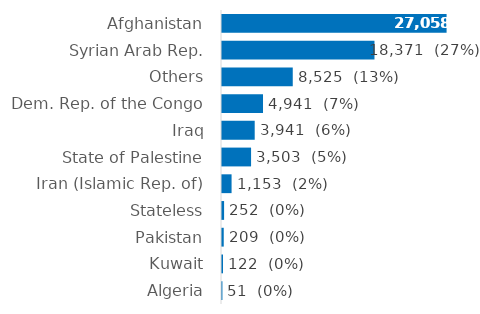
| Category | Series 0 |
|---|---|
| Afghanistan | 27058 |
| Syrian Arab Rep. | 18371 |
| Others | 8525 |
| Dem. Rep. of the Congo | 4941 |
| Iraq | 3941 |
| State of Palestine | 3503 |
| Iran (Islamic Rep. of) | 1153 |
| Stateless | 252 |
| Pakistan | 209 |
| Kuwait | 122 |
| Algeria | 51 |